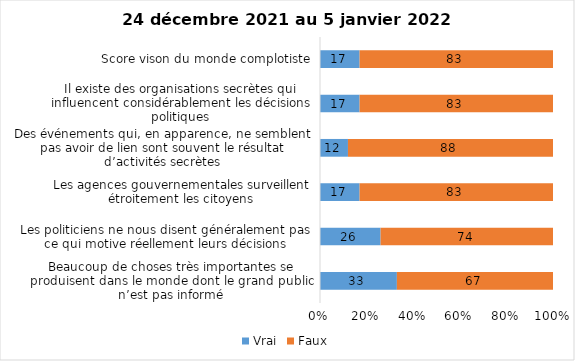
| Category | Vrai | Faux |
|---|---|---|
| Beaucoup de choses très importantes se produisent dans le monde dont le grand public n’est pas informé | 33 | 67 |
| Les politiciens ne nous disent généralement pas ce qui motive réellement leurs décisions | 26 | 74 |
| Les agences gouvernementales surveillent étroitement les citoyens | 17 | 83 |
| Des événements qui, en apparence, ne semblent pas avoir de lien sont souvent le résultat d’activités secrètes | 12 | 88 |
| Il existe des organisations secrètes qui influencent considérablement les décisions politiques | 17 | 83 |
| Score vison du monde complotiste | 17 | 83 |